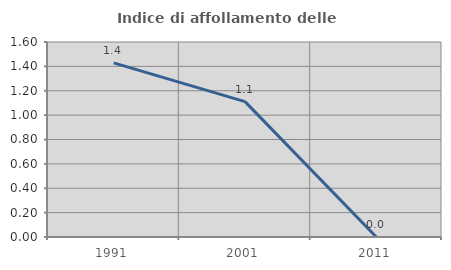
| Category | Indice di affollamento delle abitazioni  |
|---|---|
| 1991.0 | 1.429 |
| 2001.0 | 1.111 |
| 2011.0 | 0 |